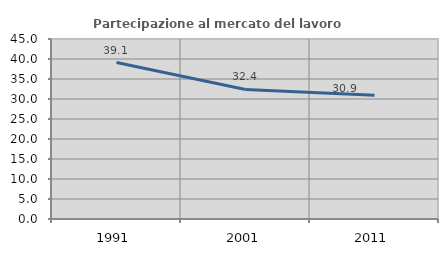
| Category | Partecipazione al mercato del lavoro  femminile |
|---|---|
| 1991.0 | 39.124 |
| 2001.0 | 32.381 |
| 2011.0 | 30.945 |